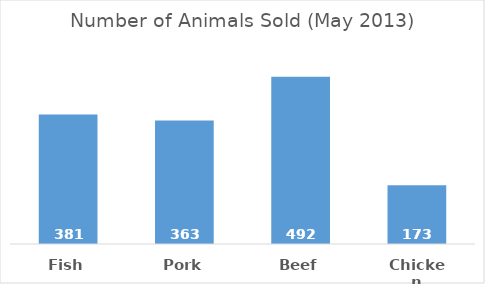
| Category | May |
|---|---|
| Fish | 381 |
| Pork | 363 |
| Beef | 492 |
| Chicken | 173 |